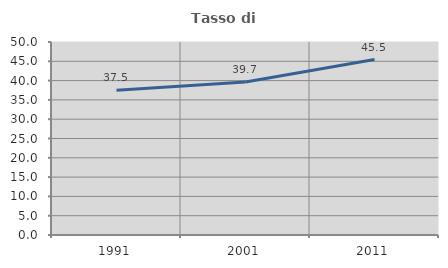
| Category | Tasso di occupazione   |
|---|---|
| 1991.0 | 37.511 |
| 2001.0 | 39.655 |
| 2011.0 | 45.455 |